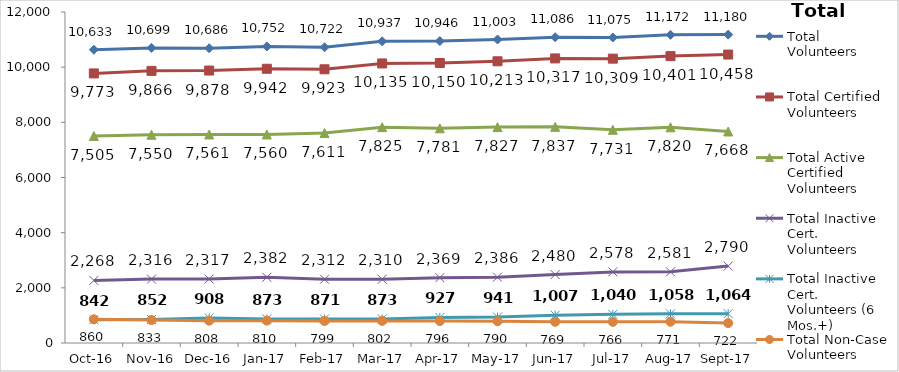
| Category | Total Volunteers | Total Certified Volunteers | Total Active Certified Volunteers | Total Inactive Cert. Volunteers | Total Inactive Cert. Volunteers (6 Mos.+) | Total Non-Case Volunteers |
|---|---|---|---|---|---|---|
| 2016-10-01 | 10633 | 9773 | 7505 | 2268 | 842 | 860 |
| 2016-11-01 | 10699 | 9866 | 7550 | 2316 | 852 | 833 |
| 2016-12-01 | 10686 | 9878 | 7561 | 2317 | 908 | 808 |
| 2017-01-01 | 10752 | 9942 | 7560 | 2382 | 873 | 810 |
| 2017-02-01 | 10722 | 9923 | 7611 | 2312 | 871 | 799 |
| 2017-03-01 | 10937 | 10135 | 7825 | 2310 | 873 | 802 |
| 2017-04-01 | 10946 | 10150 | 7781 | 2369 | 927 | 796 |
| 2017-05-01 | 11003 | 10213 | 7827 | 2386 | 941 | 790 |
| 2017-06-01 | 11086 | 10317 | 7837 | 2480 | 1007 | 769 |
| 2017-07-01 | 11075 | 10309 | 7731 | 2578 | 1040 | 766 |
| 2017-08-01 | 11172 | 10401 | 7820 | 2581 | 1058 | 771 |
| 2017-09-01 | 11180 | 10458 | 7668 | 2790 | 1064 | 722 |